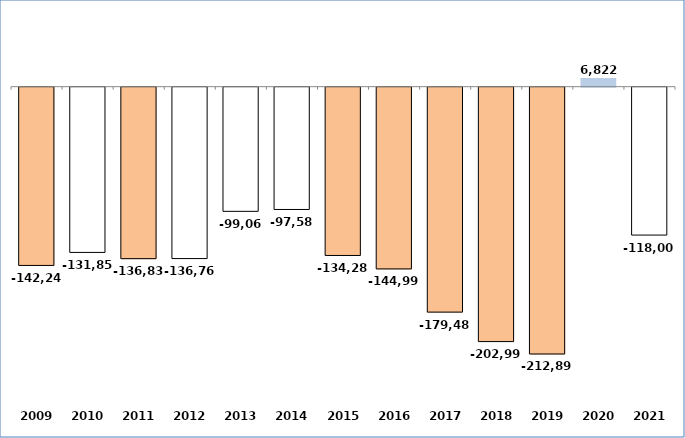
| Category | Series 0 |
|---|---|
| 2009 | -142244 |
| 2010 | -131858.36 |
| 2011 | -136834.29 |
| 2012 | -136761.55 |
| 2013 | -99068.6 |
| 2014 | -97582.15 |
| 2015 | -134288.66 |
| 2016 | -144996.63 |
| 2017 | -179485.06 |
| 2018 | -202995.91 |
| 2019 | -212894 |
| 2020 | 6822 |
| 2021 | -118003.864 |